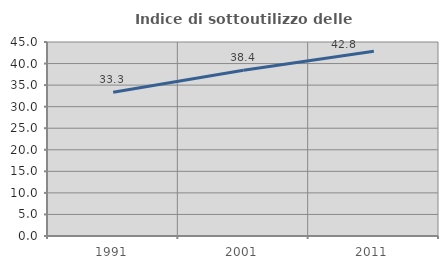
| Category | Indice di sottoutilizzo delle abitazioni  |
|---|---|
| 1991.0 | 33.328 |
| 2001.0 | 38.447 |
| 2011.0 | 42.836 |